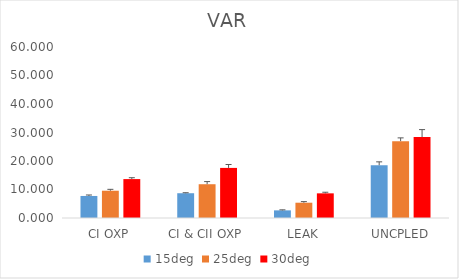
| Category | 15deg | 25deg | 30deg |
|---|---|---|---|
| CI OXP | 7.731 | 9.571 | 13.651 |
| CI & CII OXP | 8.693 | 11.85 | 17.576 |
| LEAK | 2.678 | 5.365 | 8.65 |
| UNCPLED | 18.509 | 26.97 | 28.379 |